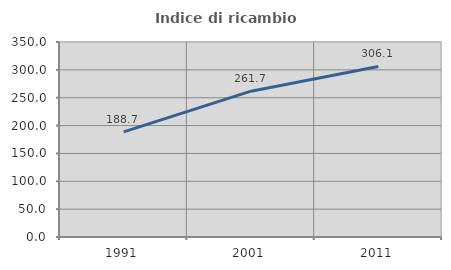
| Category | Indice di ricambio occupazionale  |
|---|---|
| 1991.0 | 188.7 |
| 2001.0 | 261.737 |
| 2011.0 | 306.072 |